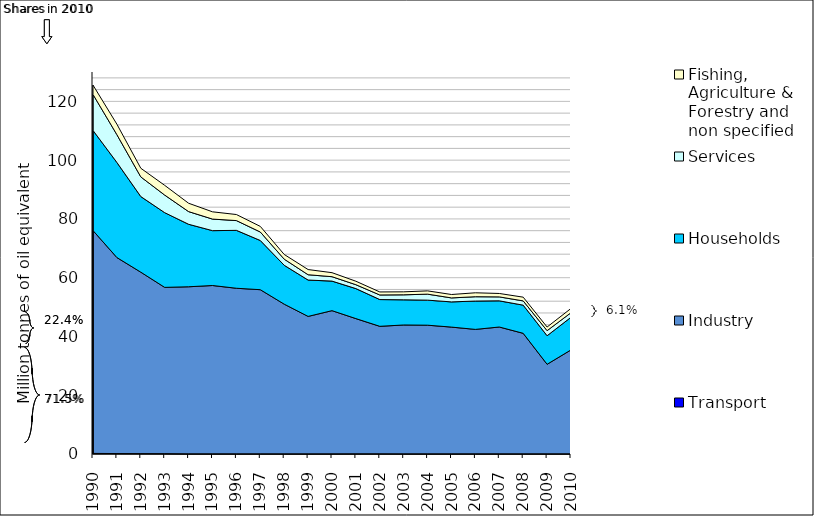
| Category | Transport | Industry | Households | Services | Fishing, Agriculture & Forestry and non specified |
|---|---|---|---|---|---|
| 1990.0 | 0.207 | 75.836 | 34.074 | 12.247 | 3.172 |
| 1991.0 | 0.152 | 66.703 | 32.36 | 9.459 | 3.563 |
| 1992.0 | 0.118 | 61.759 | 25.735 | 6.691 | 2.939 |
| 1993.0 | 0.097 | 56.605 | 25.429 | 5.984 | 3.313 |
| 1994.0 | 0.018 | 56.891 | 21.268 | 4.314 | 2.843 |
| 1995.0 | 0.017 | 57.322 | 18.672 | 3.936 | 2.47 |
| 1996.0 | 0.014 | 56.388 | 19.707 | 3.326 | 2.064 |
| 1997.0 | 0.014 | 55.901 | 16.747 | 2.886 | 1.91 |
| 1998.0 | 0.007 | 50.99 | 13.234 | 2.079 | 1.599 |
| 1999.0 | 0.004 | 46.818 | 12.378 | 1.807 | 1.765 |
| 2000.0 | 0.01 | 48.776 | 10.052 | 1.5 | 1.366 |
| 2001.0 | 0.032 | 46.046 | 10.211 | 1.322 | 1.187 |
| 2002.0 | 0.03 | 43.42 | 9.112 | 1.559 | 1.03 |
| 2003.0 | 0.006 | 43.904 | 8.562 | 1.698 | 1.016 |
| 2004.0 | 0.006 | 43.826 | 8.528 | 2.04 | 1.116 |
| 2005.0 | 0.008 | 43.175 | 8.577 | 1.36 | 1.159 |
| 2006.0 | 0.012 | 42.392 | 9.646 | 1.472 | 1.343 |
| 2007.0 | 0.012 | 43.207 | 8.905 | 1.343 | 1.161 |
| 2008.0 | 0.012 | 41.057 | 9.585 | 1.449 | 1.268 |
| 2009.0 | 0.011 | 30.517 | 9.724 | 1.721 | 1.235 |
| 2010.0 | 0.011 | 35.414 | 11.106 | 1.552 | 1.456 |